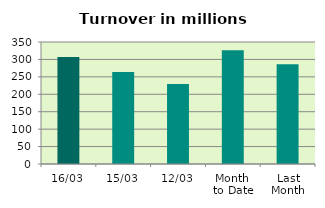
| Category | Series 0 |
|---|---|
| 16/03 | 306.984 |
| 15/03 | 263.757 |
| 12/03 | 229.859 |
| Month 
to Date | 326.489 |
| Last
Month | 285.972 |